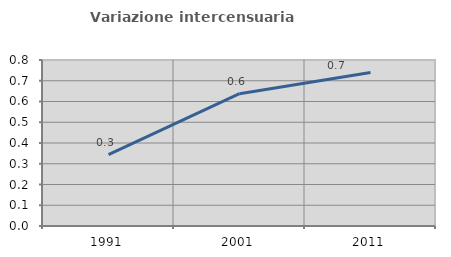
| Category | Variazione intercensuaria annua |
|---|---|
| 1991.0 | 0.344 |
| 2001.0 | 0.638 |
| 2011.0 | 0.74 |